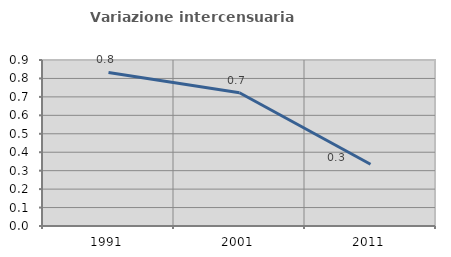
| Category | Variazione intercensuaria annua |
|---|---|
| 1991.0 | 0.833 |
| 2001.0 | 0.723 |
| 2011.0 | 0.335 |